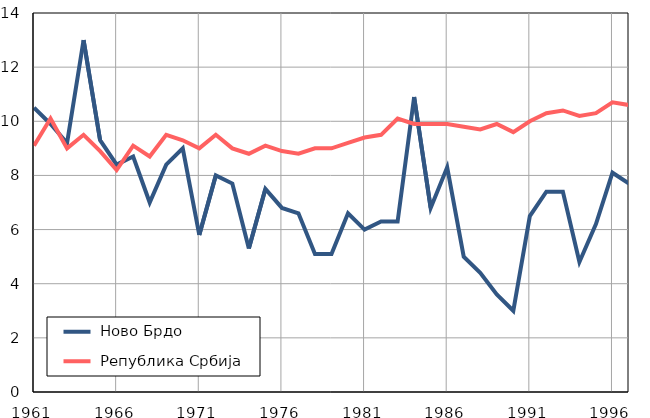
| Category |  Ново Брдо |  Република Србија |
|---|---|---|
| 1961.0 | 10.5 | 9.1 |
| 1962.0 | 9.9 | 10.1 |
| 1963.0 | 9.2 | 9 |
| 1964.0 | 13 | 9.5 |
| 1965.0 | 9.3 | 8.9 |
| 1966.0 | 8.4 | 8.2 |
| 1967.0 | 8.7 | 9.1 |
| 1968.0 | 7 | 8.7 |
| 1969.0 | 8.4 | 9.5 |
| 1970.0 | 9 | 9.3 |
| 1971.0 | 5.8 | 9 |
| 1972.0 | 8 | 9.5 |
| 1973.0 | 7.7 | 9 |
| 1974.0 | 5.3 | 8.8 |
| 1975.0 | 7.5 | 9.1 |
| 1976.0 | 6.8 | 8.9 |
| 1977.0 | 6.6 | 8.8 |
| 1978.0 | 5.1 | 9 |
| 1979.0 | 5.1 | 9 |
| 1980.0 | 6.6 | 9.2 |
| 1981.0 | 6 | 9.4 |
| 1982.0 | 6.3 | 9.5 |
| 1983.0 | 6.3 | 10.1 |
| 1984.0 | 10.9 | 9.9 |
| 1985.0 | 6.8 | 9.9 |
| 1986.0 | 8.3 | 9.9 |
| 1987.0 | 5 | 9.8 |
| 1988.0 | 4.4 | 9.7 |
| 1989.0 | 3.6 | 9.9 |
| 1990.0 | 3 | 9.6 |
| 1991.0 | 6.5 | 10 |
| 1992.0 | 7.4 | 10.3 |
| 1993.0 | 7.4 | 10.4 |
| 1994.0 | 4.8 | 10.2 |
| 1995.0 | 6.2 | 10.3 |
| 1996.0 | 8.1 | 10.7 |
| 1997.0 | 7.7 | 10.6 |